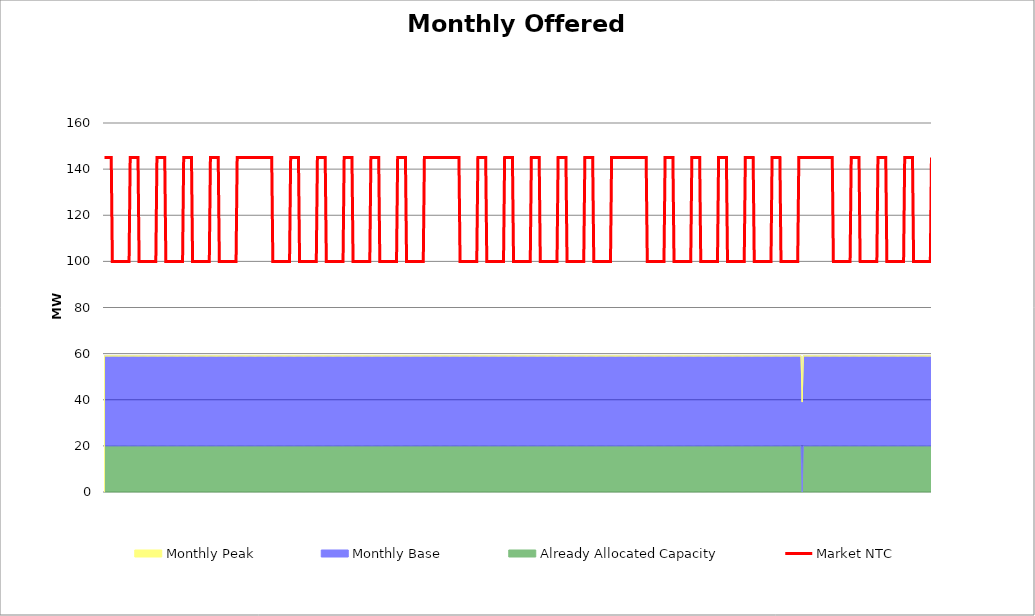
| Category | Market NTC |
|---|---|
| 0 | 145 |
| 1 | 145 |
| 2 | 145 |
| 3 | 145 |
| 4 | 145 |
| 5 | 145 |
| 6 | 145 |
| 7 | 100 |
| 8 | 100 |
| 9 | 100 |
| 10 | 100 |
| 11 | 100 |
| 12 | 100 |
| 13 | 100 |
| 14 | 100 |
| 15 | 100 |
| 16 | 100 |
| 17 | 100 |
| 18 | 100 |
| 19 | 100 |
| 20 | 100 |
| 21 | 100 |
| 22 | 100 |
| 23 | 145 |
| 24 | 145 |
| 25 | 145 |
| 26 | 145 |
| 27 | 145 |
| 28 | 145 |
| 29 | 145 |
| 30 | 145 |
| 31 | 100 |
| 32 | 100 |
| 33 | 100 |
| 34 | 100 |
| 35 | 100 |
| 36 | 100 |
| 37 | 100 |
| 38 | 100 |
| 39 | 100 |
| 40 | 100 |
| 41 | 100 |
| 42 | 100 |
| 43 | 100 |
| 44 | 100 |
| 45 | 100 |
| 46 | 100 |
| 47 | 145 |
| 48 | 145 |
| 49 | 145 |
| 50 | 145 |
| 51 | 145 |
| 52 | 145 |
| 53 | 145 |
| 54 | 145 |
| 55 | 100 |
| 56 | 100 |
| 57 | 100 |
| 58 | 100 |
| 59 | 100 |
| 60 | 100 |
| 61 | 100 |
| 62 | 100 |
| 63 | 100 |
| 64 | 100 |
| 65 | 100 |
| 66 | 100 |
| 67 | 100 |
| 68 | 100 |
| 69 | 100 |
| 70 | 100 |
| 71 | 145 |
| 72 | 145 |
| 73 | 145 |
| 74 | 145 |
| 75 | 145 |
| 76 | 145 |
| 77 | 145 |
| 78 | 145 |
| 79 | 100 |
| 80 | 100 |
| 81 | 100 |
| 82 | 100 |
| 83 | 100 |
| 84 | 100 |
| 85 | 100 |
| 86 | 100 |
| 87 | 100 |
| 88 | 100 |
| 89 | 100 |
| 90 | 100 |
| 91 | 100 |
| 92 | 100 |
| 93 | 100 |
| 94 | 100 |
| 95 | 145 |
| 96 | 145 |
| 97 | 145 |
| 98 | 145 |
| 99 | 145 |
| 100 | 145 |
| 101 | 145 |
| 102 | 145 |
| 103 | 100 |
| 104 | 100 |
| 105 | 100 |
| 106 | 100 |
| 107 | 100 |
| 108 | 100 |
| 109 | 100 |
| 110 | 100 |
| 111 | 100 |
| 112 | 100 |
| 113 | 100 |
| 114 | 100 |
| 115 | 100 |
| 116 | 100 |
| 117 | 100 |
| 118 | 100 |
| 119 | 145 |
| 120 | 145 |
| 121 | 145 |
| 122 | 145 |
| 123 | 145 |
| 124 | 145 |
| 125 | 145 |
| 126 | 145 |
| 127 | 145 |
| 128 | 145 |
| 129 | 145 |
| 130 | 145 |
| 131 | 145 |
| 132 | 145 |
| 133 | 145 |
| 134 | 145 |
| 135 | 145 |
| 136 | 145 |
| 137 | 145 |
| 138 | 145 |
| 139 | 145 |
| 140 | 145 |
| 141 | 145 |
| 142 | 145 |
| 143 | 145 |
| 144 | 145 |
| 145 | 145 |
| 146 | 145 |
| 147 | 145 |
| 148 | 145 |
| 149 | 145 |
| 150 | 145 |
| 151 | 100 |
| 152 | 100 |
| 153 | 100 |
| 154 | 100 |
| 155 | 100 |
| 156 | 100 |
| 157 | 100 |
| 158 | 100 |
| 159 | 100 |
| 160 | 100 |
| 161 | 100 |
| 162 | 100 |
| 163 | 100 |
| 164 | 100 |
| 165 | 100 |
| 166 | 100 |
| 167 | 145 |
| 168 | 145 |
| 169 | 145 |
| 170 | 145 |
| 171 | 145 |
| 172 | 145 |
| 173 | 145 |
| 174 | 145 |
| 175 | 100 |
| 176 | 100 |
| 177 | 100 |
| 178 | 100 |
| 179 | 100 |
| 180 | 100 |
| 181 | 100 |
| 182 | 100 |
| 183 | 100 |
| 184 | 100 |
| 185 | 100 |
| 186 | 100 |
| 187 | 100 |
| 188 | 100 |
| 189 | 100 |
| 190 | 100 |
| 191 | 145 |
| 192 | 145 |
| 193 | 145 |
| 194 | 145 |
| 195 | 145 |
| 196 | 145 |
| 197 | 145 |
| 198 | 145 |
| 199 | 100 |
| 200 | 100 |
| 201 | 100 |
| 202 | 100 |
| 203 | 100 |
| 204 | 100 |
| 205 | 100 |
| 206 | 100 |
| 207 | 100 |
| 208 | 100 |
| 209 | 100 |
| 210 | 100 |
| 211 | 100 |
| 212 | 100 |
| 213 | 100 |
| 214 | 100 |
| 215 | 145 |
| 216 | 145 |
| 217 | 145 |
| 218 | 145 |
| 219 | 145 |
| 220 | 145 |
| 221 | 145 |
| 222 | 145 |
| 223 | 100 |
| 224 | 100 |
| 225 | 100 |
| 226 | 100 |
| 227 | 100 |
| 228 | 100 |
| 229 | 100 |
| 230 | 100 |
| 231 | 100 |
| 232 | 100 |
| 233 | 100 |
| 234 | 100 |
| 235 | 100 |
| 236 | 100 |
| 237 | 100 |
| 238 | 100 |
| 239 | 145 |
| 240 | 145 |
| 241 | 145 |
| 242 | 145 |
| 243 | 145 |
| 244 | 145 |
| 245 | 145 |
| 246 | 145 |
| 247 | 100 |
| 248 | 100 |
| 249 | 100 |
| 250 | 100 |
| 251 | 100 |
| 252 | 100 |
| 253 | 100 |
| 254 | 100 |
| 255 | 100 |
| 256 | 100 |
| 257 | 100 |
| 258 | 100 |
| 259 | 100 |
| 260 | 100 |
| 261 | 100 |
| 262 | 100 |
| 263 | 145 |
| 264 | 145 |
| 265 | 145 |
| 266 | 145 |
| 267 | 145 |
| 268 | 145 |
| 269 | 145 |
| 270 | 145 |
| 271 | 100 |
| 272 | 100 |
| 273 | 100 |
| 274 | 100 |
| 275 | 100 |
| 276 | 100 |
| 277 | 100 |
| 278 | 100 |
| 279 | 100 |
| 280 | 100 |
| 281 | 100 |
| 282 | 100 |
| 283 | 100 |
| 284 | 100 |
| 285 | 100 |
| 286 | 100 |
| 287 | 145 |
| 288 | 145 |
| 289 | 145 |
| 290 | 145 |
| 291 | 145 |
| 292 | 145 |
| 293 | 145 |
| 294 | 145 |
| 295 | 145 |
| 296 | 145 |
| 297 | 145 |
| 298 | 145 |
| 299 | 145 |
| 300 | 145 |
| 301 | 145 |
| 302 | 145 |
| 303 | 145 |
| 304 | 145 |
| 305 | 145 |
| 306 | 145 |
| 307 | 145 |
| 308 | 145 |
| 309 | 145 |
| 310 | 145 |
| 311 | 145 |
| 312 | 145 |
| 313 | 145 |
| 314 | 145 |
| 315 | 145 |
| 316 | 145 |
| 317 | 145 |
| 318 | 145 |
| 319 | 100 |
| 320 | 100 |
| 321 | 100 |
| 322 | 100 |
| 323 | 100 |
| 324 | 100 |
| 325 | 100 |
| 326 | 100 |
| 327 | 100 |
| 328 | 100 |
| 329 | 100 |
| 330 | 100 |
| 331 | 100 |
| 332 | 100 |
| 333 | 100 |
| 334 | 100 |
| 335 | 145 |
| 336 | 145 |
| 337 | 145 |
| 338 | 145 |
| 339 | 145 |
| 340 | 145 |
| 341 | 145 |
| 342 | 145 |
| 343 | 100 |
| 344 | 100 |
| 345 | 100 |
| 346 | 100 |
| 347 | 100 |
| 348 | 100 |
| 349 | 100 |
| 350 | 100 |
| 351 | 100 |
| 352 | 100 |
| 353 | 100 |
| 354 | 100 |
| 355 | 100 |
| 356 | 100 |
| 357 | 100 |
| 358 | 100 |
| 359 | 145 |
| 360 | 145 |
| 361 | 145 |
| 362 | 145 |
| 363 | 145 |
| 364 | 145 |
| 365 | 145 |
| 366 | 145 |
| 367 | 100 |
| 368 | 100 |
| 369 | 100 |
| 370 | 100 |
| 371 | 100 |
| 372 | 100 |
| 373 | 100 |
| 374 | 100 |
| 375 | 100 |
| 376 | 100 |
| 377 | 100 |
| 378 | 100 |
| 379 | 100 |
| 380 | 100 |
| 381 | 100 |
| 382 | 100 |
| 383 | 145 |
| 384 | 145 |
| 385 | 145 |
| 386 | 145 |
| 387 | 145 |
| 388 | 145 |
| 389 | 145 |
| 390 | 145 |
| 391 | 100 |
| 392 | 100 |
| 393 | 100 |
| 394 | 100 |
| 395 | 100 |
| 396 | 100 |
| 397 | 100 |
| 398 | 100 |
| 399 | 100 |
| 400 | 100 |
| 401 | 100 |
| 402 | 100 |
| 403 | 100 |
| 404 | 100 |
| 405 | 100 |
| 406 | 100 |
| 407 | 145 |
| 408 | 145 |
| 409 | 145 |
| 410 | 145 |
| 411 | 145 |
| 412 | 145 |
| 413 | 145 |
| 414 | 145 |
| 415 | 100 |
| 416 | 100 |
| 417 | 100 |
| 418 | 100 |
| 419 | 100 |
| 420 | 100 |
| 421 | 100 |
| 422 | 100 |
| 423 | 100 |
| 424 | 100 |
| 425 | 100 |
| 426 | 100 |
| 427 | 100 |
| 428 | 100 |
| 429 | 100 |
| 430 | 100 |
| 431 | 145 |
| 432 | 145 |
| 433 | 145 |
| 434 | 145 |
| 435 | 145 |
| 436 | 145 |
| 437 | 145 |
| 438 | 145 |
| 439 | 100 |
| 440 | 100 |
| 441 | 100 |
| 442 | 100 |
| 443 | 100 |
| 444 | 100 |
| 445 | 100 |
| 446 | 100 |
| 447 | 100 |
| 448 | 100 |
| 449 | 100 |
| 450 | 100 |
| 451 | 100 |
| 452 | 100 |
| 453 | 100 |
| 454 | 100 |
| 455 | 145 |
| 456 | 145 |
| 457 | 145 |
| 458 | 145 |
| 459 | 145 |
| 460 | 145 |
| 461 | 145 |
| 462 | 145 |
| 463 | 145 |
| 464 | 145 |
| 465 | 145 |
| 466 | 145 |
| 467 | 145 |
| 468 | 145 |
| 469 | 145 |
| 470 | 145 |
| 471 | 145 |
| 472 | 145 |
| 473 | 145 |
| 474 | 145 |
| 475 | 145 |
| 476 | 145 |
| 477 | 145 |
| 478 | 145 |
| 479 | 145 |
| 480 | 145 |
| 481 | 145 |
| 482 | 145 |
| 483 | 145 |
| 484 | 145 |
| 485 | 145 |
| 486 | 145 |
| 487 | 100 |
| 488 | 100 |
| 489 | 100 |
| 490 | 100 |
| 491 | 100 |
| 492 | 100 |
| 493 | 100 |
| 494 | 100 |
| 495 | 100 |
| 496 | 100 |
| 497 | 100 |
| 498 | 100 |
| 499 | 100 |
| 500 | 100 |
| 501 | 100 |
| 502 | 100 |
| 503 | 145 |
| 504 | 145 |
| 505 | 145 |
| 506 | 145 |
| 507 | 145 |
| 508 | 145 |
| 509 | 145 |
| 510 | 145 |
| 511 | 100 |
| 512 | 100 |
| 513 | 100 |
| 514 | 100 |
| 515 | 100 |
| 516 | 100 |
| 517 | 100 |
| 518 | 100 |
| 519 | 100 |
| 520 | 100 |
| 521 | 100 |
| 522 | 100 |
| 523 | 100 |
| 524 | 100 |
| 525 | 100 |
| 526 | 100 |
| 527 | 145 |
| 528 | 145 |
| 529 | 145 |
| 530 | 145 |
| 531 | 145 |
| 532 | 145 |
| 533 | 145 |
| 534 | 145 |
| 535 | 100 |
| 536 | 100 |
| 537 | 100 |
| 538 | 100 |
| 539 | 100 |
| 540 | 100 |
| 541 | 100 |
| 542 | 100 |
| 543 | 100 |
| 544 | 100 |
| 545 | 100 |
| 546 | 100 |
| 547 | 100 |
| 548 | 100 |
| 549 | 100 |
| 550 | 100 |
| 551 | 145 |
| 552 | 145 |
| 553 | 145 |
| 554 | 145 |
| 555 | 145 |
| 556 | 145 |
| 557 | 145 |
| 558 | 145 |
| 559 | 100 |
| 560 | 100 |
| 561 | 100 |
| 562 | 100 |
| 563 | 100 |
| 564 | 100 |
| 565 | 100 |
| 566 | 100 |
| 567 | 100 |
| 568 | 100 |
| 569 | 100 |
| 570 | 100 |
| 571 | 100 |
| 572 | 100 |
| 573 | 100 |
| 574 | 100 |
| 575 | 145 |
| 576 | 145 |
| 577 | 145 |
| 578 | 145 |
| 579 | 145 |
| 580 | 145 |
| 581 | 145 |
| 582 | 145 |
| 583 | 100 |
| 584 | 100 |
| 585 | 100 |
| 586 | 100 |
| 587 | 100 |
| 588 | 100 |
| 589 | 100 |
| 590 | 100 |
| 591 | 100 |
| 592 | 100 |
| 593 | 100 |
| 594 | 100 |
| 595 | 100 |
| 596 | 100 |
| 597 | 100 |
| 598 | 100 |
| 599 | 145 |
| 600 | 145 |
| 601 | 145 |
| 602 | 145 |
| 603 | 145 |
| 604 | 145 |
| 605 | 145 |
| 606 | 145 |
| 607 | 100 |
| 608 | 100 |
| 609 | 100 |
| 610 | 100 |
| 611 | 100 |
| 612 | 100 |
| 613 | 100 |
| 614 | 100 |
| 615 | 100 |
| 616 | 100 |
| 617 | 100 |
| 618 | 100 |
| 619 | 100 |
| 620 | 100 |
| 621 | 100 |
| 622 | 100 |
| 623 | 145 |
| 624 | 145 |
| 625 | 145 |
| 626 | 145 |
| 627 | 145 |
| 628 | 145 |
| 629 | 145 |
| 630 | 145 |
| 631 | 145 |
| 632 | 145 |
| 633 | 145 |
| 634 | 145 |
| 635 | 145 |
| 636 | 145 |
| 637 | 145 |
| 638 | 145 |
| 639 | 145 |
| 640 | 145 |
| 641 | 145 |
| 642 | 145 |
| 643 | 145 |
| 644 | 145 |
| 645 | 145 |
| 646 | 145 |
| 647 | 145 |
| 648 | 145 |
| 649 | 145 |
| 650 | 145 |
| 651 | 145 |
| 652 | 145 |
| 653 | 145 |
| 654 | 100 |
| 655 | 100 |
| 656 | 100 |
| 657 | 100 |
| 658 | 100 |
| 659 | 100 |
| 660 | 100 |
| 661 | 100 |
| 662 | 100 |
| 663 | 100 |
| 664 | 100 |
| 665 | 100 |
| 666 | 100 |
| 667 | 100 |
| 668 | 100 |
| 669 | 100 |
| 670 | 145 |
| 671 | 145 |
| 672 | 145 |
| 673 | 145 |
| 674 | 145 |
| 675 | 145 |
| 676 | 145 |
| 677 | 145 |
| 678 | 100 |
| 679 | 100 |
| 680 | 100 |
| 681 | 100 |
| 682 | 100 |
| 683 | 100 |
| 684 | 100 |
| 685 | 100 |
| 686 | 100 |
| 687 | 100 |
| 688 | 100 |
| 689 | 100 |
| 690 | 100 |
| 691 | 100 |
| 692 | 100 |
| 693 | 100 |
| 694 | 145 |
| 695 | 145 |
| 696 | 145 |
| 697 | 145 |
| 698 | 145 |
| 699 | 145 |
| 700 | 145 |
| 701 | 145 |
| 702 | 100 |
| 703 | 100 |
| 704 | 100 |
| 705 | 100 |
| 706 | 100 |
| 707 | 100 |
| 708 | 100 |
| 709 | 100 |
| 710 | 100 |
| 711 | 100 |
| 712 | 100 |
| 713 | 100 |
| 714 | 100 |
| 715 | 100 |
| 716 | 100 |
| 717 | 100 |
| 718 | 145 |
| 719 | 145 |
| 720 | 145 |
| 721 | 145 |
| 722 | 145 |
| 723 | 145 |
| 724 | 145 |
| 725 | 145 |
| 726 | 100 |
| 727 | 100 |
| 728 | 100 |
| 729 | 100 |
| 730 | 100 |
| 731 | 100 |
| 732 | 100 |
| 733 | 100 |
| 734 | 100 |
| 735 | 100 |
| 736 | 100 |
| 737 | 100 |
| 738 | 100 |
| 739 | 100 |
| 740 | 100 |
| 741 | 100 |
| 742 | 145 |